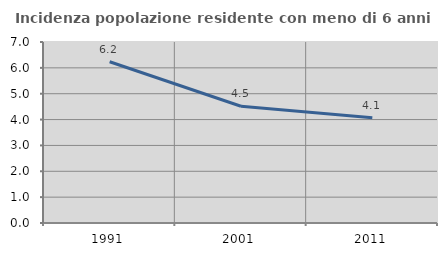
| Category | Incidenza popolazione residente con meno di 6 anni |
|---|---|
| 1991.0 | 6.236 |
| 2001.0 | 4.515 |
| 2011.0 | 4.072 |